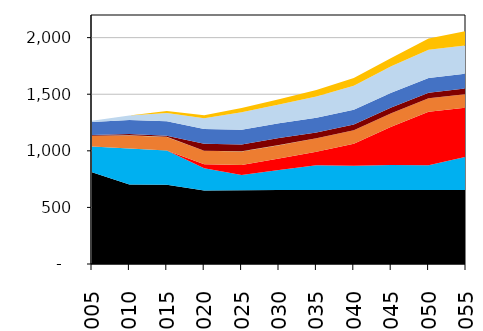
| Category | Series 2 | Series 3 | Series 4 | Series 1 | Series 0 | Series 5 | Series 6 | Series 7 | Series 8 | Series 9 | Series 10 | Series 11 | Series 12 | Series 13 |
|---|---|---|---|---|---|---|---|---|---|---|---|---|---|---|
| 2005.0 | 0 | 811.16 | 0 | 226.05 | 0 | 0.51 | 93.83 | 0 | 0 | 1.21 | 7.9 | 114.16 | 10.45 | 1.24 |
| 2010.0 | 0 | 701.47 | 0 | 319.1 | 0 | 0.75 | 114.57 | 0 | 0 | 1.21 | 10.72 | 125.19 | 38.5 | 0.31 |
| 2015.0 | 0 | 701.24 | 0 | 302.08 | 0 | 0.52 | 118.68 | 0 | 0 | 1.21 | 9.38 | 128.93 | 72.7 | 16.65 |
| 2020.0 | 0 | 650.44 | 0 | 196.09 | 35.13 | 0.03 | 118.68 | 0 | 0 | 1.21 | 61.19 | 129.93 | 95.23 | 26.91 |
| 2025.0 | 0 | 652.21 | 0 | 133.23 | 89.75 | 0.02 | 118.68 | 0 | 0 | 1.26 | 61.19 | 129.93 | 154.18 | 37.16 |
| 2030.0 | 0 | 653.07 | 0 | 177.97 | 100.41 | 0.02 | 118.68 | 0 | 0 | 1.21 | 61.19 | 129.93 | 166.2 | 47.42 |
| 2035.0 | 0 | 653.07 | 0 | 219.42 | 119.63 | 0.02 | 118.68 | 0 | 0 | 1.21 | 50.47 | 129.93 | 188.21 | 57.45 |
| 2040.0 | 0 | 653.07 | 0 | 215.51 | 193.85 | 0.02 | 118.68 | 0 | 0 | 1.21 | 50.47 | 129.93 | 212.64 | 67.71 |
| 2045.0 | 0 | 653.07 | 0 | 221.66 | 338.05 | 0.02 | 118.68 | 0 | 0 | 1.21 | 50.47 | 129.93 | 233.78 | 73.78 |
| 2050.0 | 0 | 653.07 | 0 | 218.94 | 472.87 | 0.02 | 118.68 | 0 | 0 | 0 | 50.47 | 129.93 | 249.61 | 99.16 |
| 2055.0 | 0 | 653.07 | 0 | 294.7 | 434.35 | 0.02 | 118.68 | 0 | 0 | 0 | 50.47 | 129.93 | 249.61 | 128.23 |